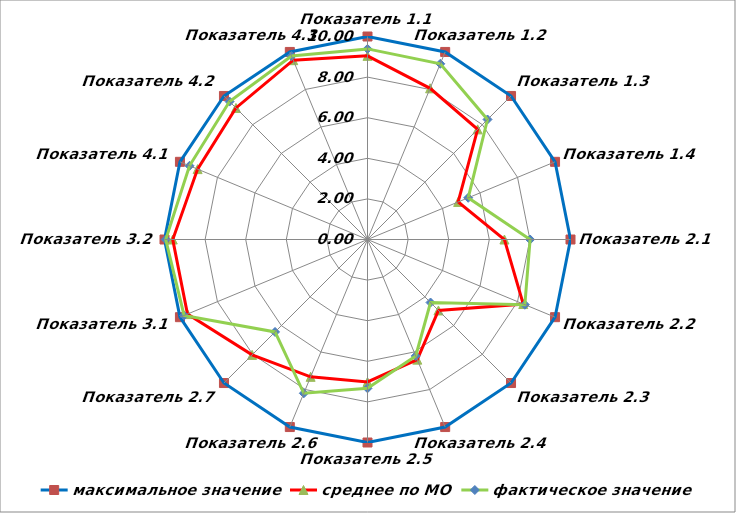
| Category | максимальное значение | среднее по МО | фактическое значение |
|---|---|---|---|
| Показатель 1.1 | 10 | 9.046 | 9.39 |
| Показатель 1.2 | 10 | 8.061 | 9.37 |
| Показатель 1.3 | 10 | 7.673 | 8.36 |
| Показатель 1.4 | 10 | 4.833 | 5.37 |
| Показатель 2.1 | 10 | 6.745 | 8.01 |
| Показатель 2.2 | 10 | 8.305 | 8.39 |
| Показатель 2.3 | 10 | 4.943 | 4.39 |
| Показатель 2.4 | 10 | 6.405 | 6.21 |
| Показатель 2.5 | 10 | 7.017 | 7.33 |
| Показатель 2.6 | 10 | 7.323 | 8.2 |
| Показатель 2.7 | 10 | 8.039 | 6.44 |
| Показатель 3.1 | 10 | 9.599 | 9.78 |
| Показатель 3.2 | 10 | 9.593 | 9.94 |
| Показатель 4.1 | 10 | 9.059 | 9.49 |
| Показатель 4.2 | 10 | 9.164 | 9.61 |
| Показатель 4.3 | 10 | 9.561 | 9.78 |